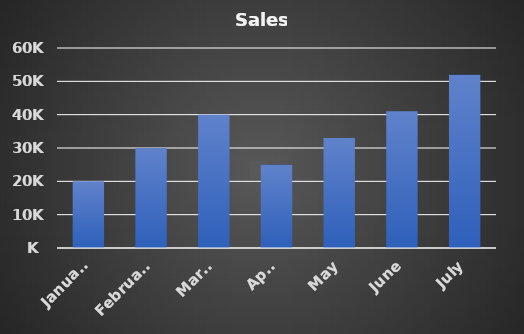
| Category | Sales |
|---|---|
| January | 20000 |
| February | 30000 |
| March | 40000 |
| April | 25000 |
| May | 33000 |
| June | 41000 |
| July | 52000 |